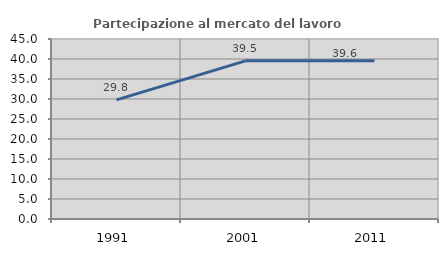
| Category | Partecipazione al mercato del lavoro  femminile |
|---|---|
| 1991.0 | 29.781 |
| 2001.0 | 39.541 |
| 2011.0 | 39.576 |